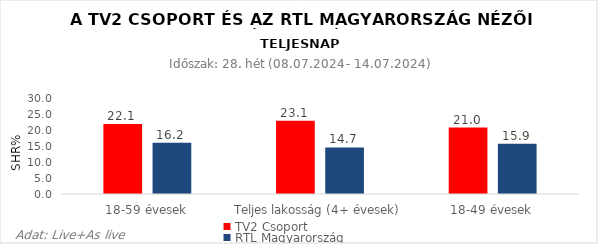
| Category | TV2 Csoport | RTL Magyarország |
|---|---|---|
| 18-59 évesek | 22.1 | 16.2 |
| Teljes lakosság (4+ évesek) | 23.1 | 14.7 |
| 18-49 évesek | 21 | 15.9 |